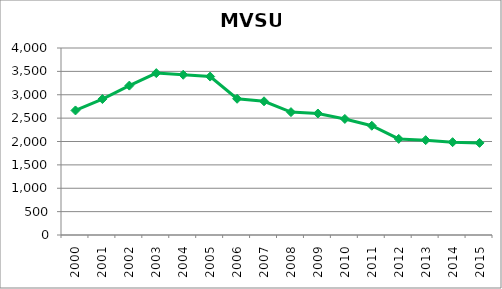
| Category | Series 0 |
|---|---|
| 2000.0 | 2664.308 |
| 2001.0 | 2908.025 |
| 2002.0 | 3195.358 |
| 2003.0 | 3462.75 |
| 2004.0 | 3427.692 |
| 2005.0 | 3389.008 |
| 2006.0 | 2914.1 |
| 2007.0 | 2860.175 |
| 2008.0 | 2628.508 |
| 2009.0 | 2599.208 |
| 2010.0 | 2482.767 |
| 2011.0 | 2336.942 |
| 2012.0 | 2055.658 |
| 2013.0 | 2028.875 |
| 2014.0 | 1985.95 |
| 2015.0 | 1970.042 |